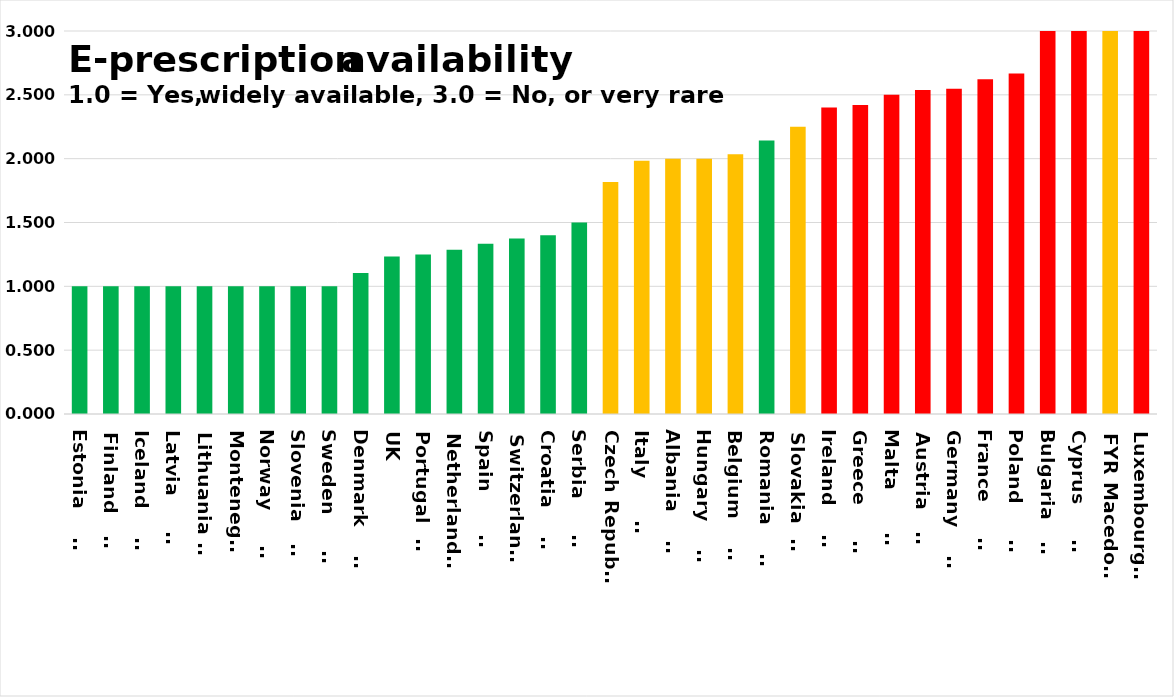
| Category | Series 0 |
|---|---|
| Estonia        | 1 |
| Finland        | 1 |
| Iceland        | 1 |
| Latvia         | 1 |
| Lithuania      | 1 |
| Montenegro | 1 |
| Norway         | 1 |
| Slovenia       | 1 |
| Sweden         | 1 |
| Denmark        | 1.105 |
| UK | 1.234 |
| Portugal       | 1.25 |
| Netherlands    | 1.286 |
| Spain          | 1.333 |
| Switzerland    | 1.375 |
| Croatia        | 1.4 |
| Serbia         | 1.5 |
| Czech Republic | 1.818 |
| Italy          | 1.983 |
| Albania        | 2 |
| Hungary        | 2 |
| Belgium        | 2.034 |
| Romania        | 2.143 |
| Slovakia       | 2.25 |
| Ireland        | 2.4 |
| Greece         | 2.421 |
| Malta          | 2.5 |
| Austria        | 2.538 |
| Germany        | 2.548 |
| France         | 2.621 |
| Poland         | 2.667 |
| Bulgaria       | 3 |
| Cyprus         | 3 |
| FYR Macedonia | 3 |
| Luxembourg     | 3 |